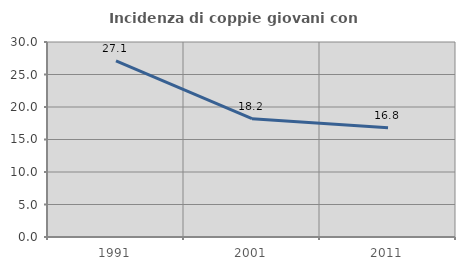
| Category | Incidenza di coppie giovani con figli |
|---|---|
| 1991.0 | 27.113 |
| 2001.0 | 18.207 |
| 2011.0 | 16.802 |